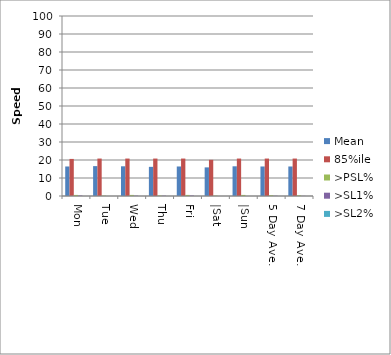
| Category | Mean | 85%ile | >PSL% | >SL1% | >SL2% |
|---|---|---|---|---|---|
| Mon | 16.4 | 20.6 | 0.6 | 0.3 | 0 |
| Tue | 16.6 | 20.8 | 0.2 | 0 | 0 |
| Wed | 16.5 | 20.8 | 0.6 | 0.2 | 0 |
| Thu | 16.2 | 20.8 | 0.3 | 0.2 | 0 |
| Fri | 16.4 | 20.8 | 0.6 | 0.3 | 0 |
| |Sat | 15.9 | 20.1 | 0.2 | 0 | 0 |
| |Sun | 16.5 | 20.8 | 0.6 | 0 | 0 |
| 5 Day Ave. | 16.4 | 20.8 | 0.465 | 0.155 | 0 |
| 7 Day Ave. | 16.4 | 20.8 | 0.4 | 0.1 | 0 |